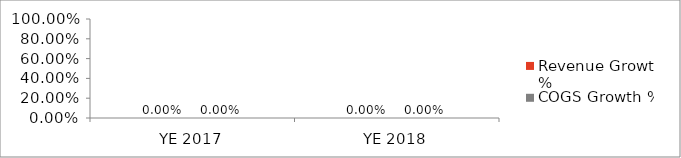
| Category | Revenue Growth % | COGS Growth % |
|---|---|---|
| YE 2017 | 0 | 0 |
| YE 2018 | 0 | 0 |